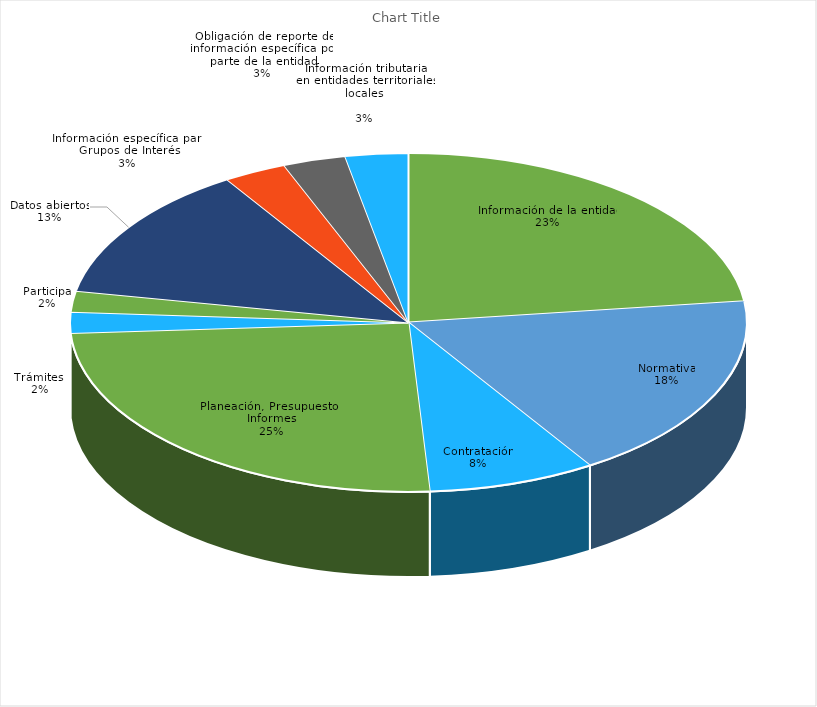
| Category | Series 0 |
|---|---|
| Información de la entidad | 0.23 |
| Normativa | 0.18 |
| Contratación | 0.08 |
| Planeación, Presupuesto e Informes | 0.25 |
| Trámites  | 0.02 |
| Participa | 0.02 |
| Datos abiertos | 0.13 |
| Información específica para Grupos de Interés | 0.03 |
| Obligación de reporte de información específica por parte de la entidad | 0.03 |
| Información tributaria_x000d_en entidades territoriales_x000d_locales_x000d_ | 0.03 |